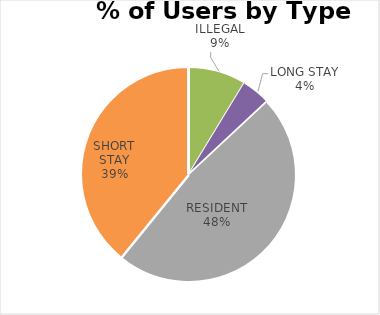
| Category | GROVE ROAD |
|---|---|
| COMMUTER | 0 |
| ILLEGAL | 2 |
| LONG STAY | 1 |
| RESIDENT | 11 |
| SHORT STAY | 9 |
| DISABLED | 0 |
| OTHER | 0 |